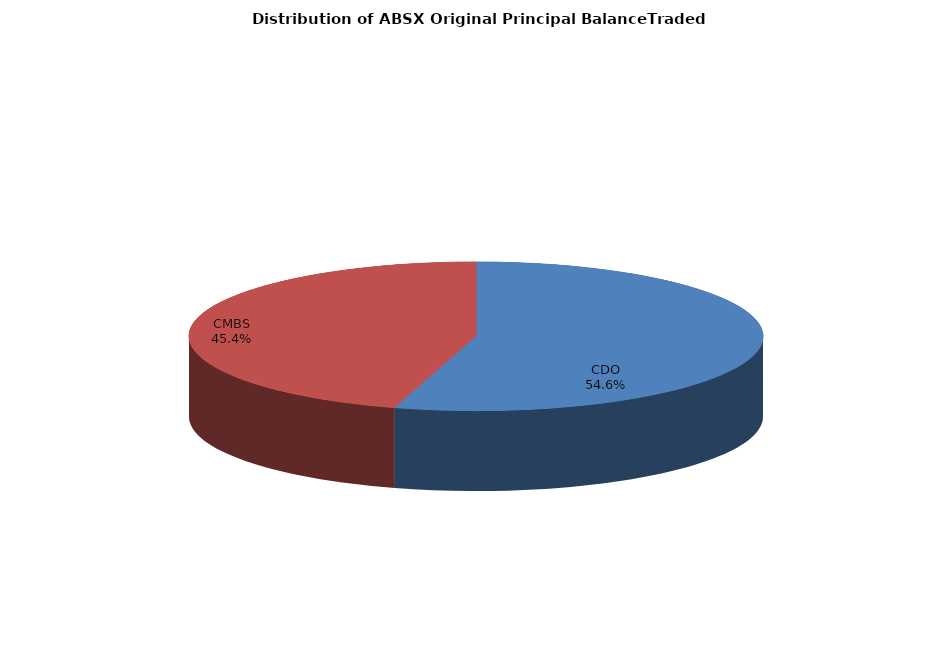
| Category | Series 0 |
|---|---|
| CDO | 1894840451.02 |
| CMBS | 1577174065.361 |